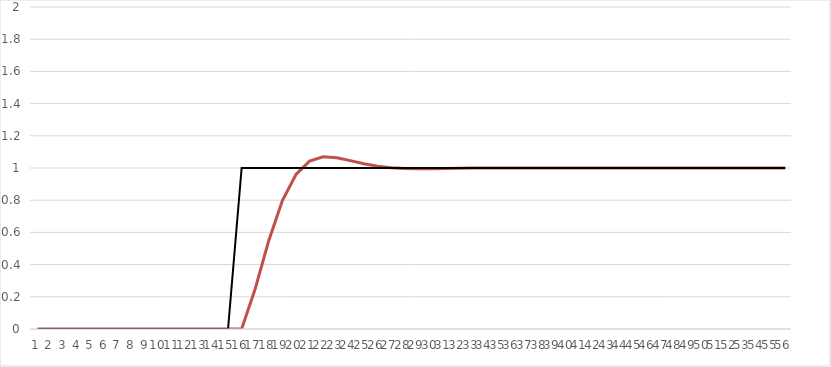
| Category | 2) | Series 5 |
|---|---|---|
| 0 | 0 | 0 |
| 1 | 0 | 0 |
| 2 | 0 | 0 |
| 3 | 0 | 0 |
| 4 | 0 | 0 |
| 5 | 0 | 0 |
| 6 | 0 | 0 |
| 7 | 0 | 0 |
| 8 | 0 | 0 |
| 9 | 0 | 0 |
| 10 | 0 | 0 |
| 11 | 0 | 0 |
| 12 | 0 | 0 |
| 13 | 0 | 0 |
| 14 | 0 | 0 |
| 15 | 0 | 1 |
| 16 | 0.25 | 1 |
| 17 | 0.55 | 1 |
| 18 | 0.798 | 1 |
| 19 | 0.959 | 1 |
| 20 | 1.043 | 1 |
| 21 | 1.069 | 1 |
| 22 | 1.064 | 1 |
| 23 | 1.046 | 1 |
| 24 | 1.026 | 1 |
| 25 | 1.011 | 1 |
| 26 | 1.001 | 1 |
| 27 | 0.996 | 1 |
| 28 | 0.995 | 1 |
| 29 | 0.996 | 1 |
| 30 | 0.997 | 1 |
| 31 | 0.999 | 1 |
| 32 | 0.999 | 1 |
| 33 | 1 | 1 |
| 34 | 1 | 1 |
| 35 | 1 | 1 |
| 36 | 1 | 1 |
| 37 | 1 | 1 |
| 38 | 1 | 1 |
| 39 | 1 | 1 |
| 40 | 1 | 1 |
| 41 | 1 | 1 |
| 42 | 1 | 1 |
| 43 | 1 | 1 |
| 44 | 1 | 1 |
| 45 | 1 | 1 |
| 46 | 1 | 1 |
| 47 | 1 | 1 |
| 48 | 1 | 1 |
| 49 | 1 | 1 |
| 50 | 1 | 1 |
| 51 | 1 | 1 |
| 52 | 1 | 1 |
| 53 | 1 | 1 |
| 54 | 1 | 1 |
| 55 | 1 | 1 |